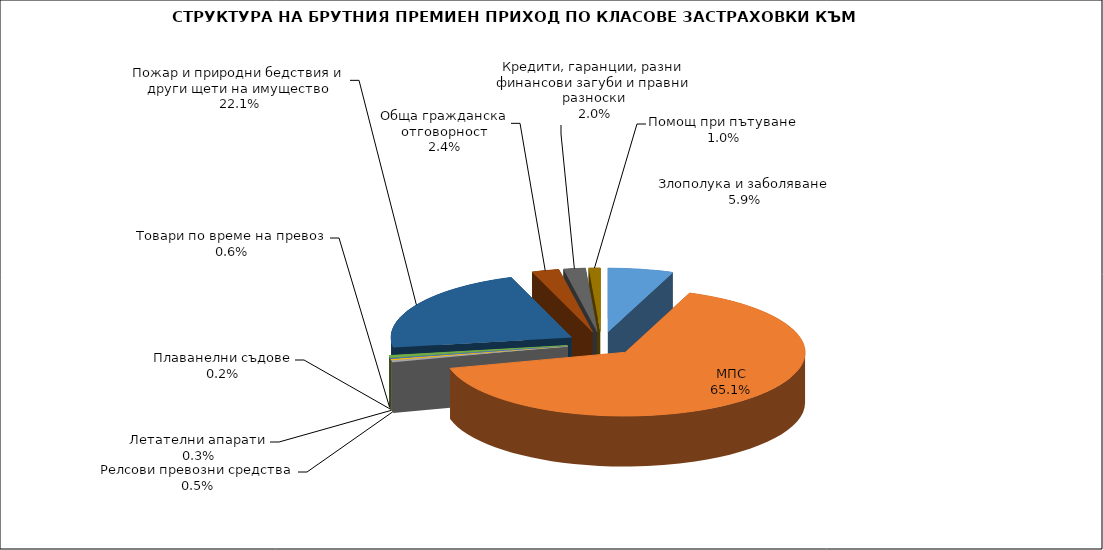
| Category | Злополука и заболяване |
|---|---|
| Злополука и заболяване | 0.059 |
| МПС | 0.651 |
| Релсови превозни средства | 0.005 |
| Летателни апарати | 0.003 |
| Плаванелни съдове | 0.002 |
| Товари по време на превоз | 0.006 |
| Пожар и природни бедствия и други щети на имущество | 0.221 |
| Обща гражданска отговорност | 0.024 |
| Кредити, гаранции, разни финансови загуби и правни разноски | 0.02 |
| Помощ при пътуване | 0.01 |